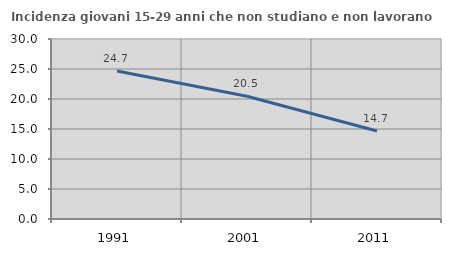
| Category | Incidenza giovani 15-29 anni che non studiano e non lavorano  |
|---|---|
| 1991.0 | 24.658 |
| 2001.0 | 20.455 |
| 2011.0 | 14.667 |